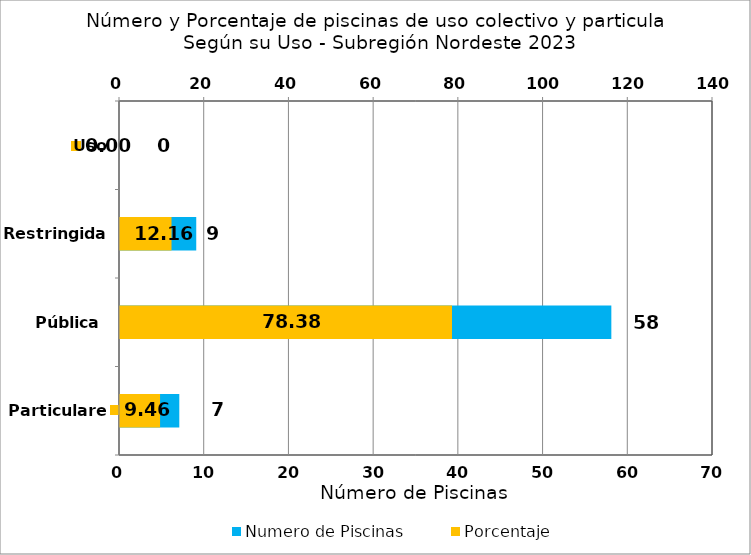
| Category | Numero de Piscinas |
|---|---|
| Particulares | 7 |
| Pública | 58 |
| Restringida | 9 |
| Uso Especial | 0 |